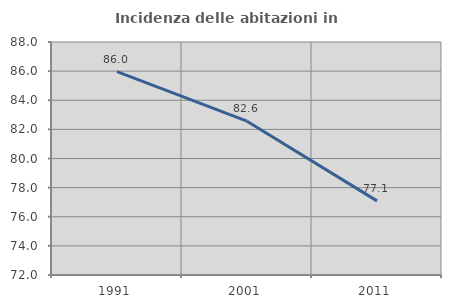
| Category | Incidenza delle abitazioni in proprietà  |
|---|---|
| 1991.0 | 85.962 |
| 2001.0 | 82.563 |
| 2011.0 | 77.089 |